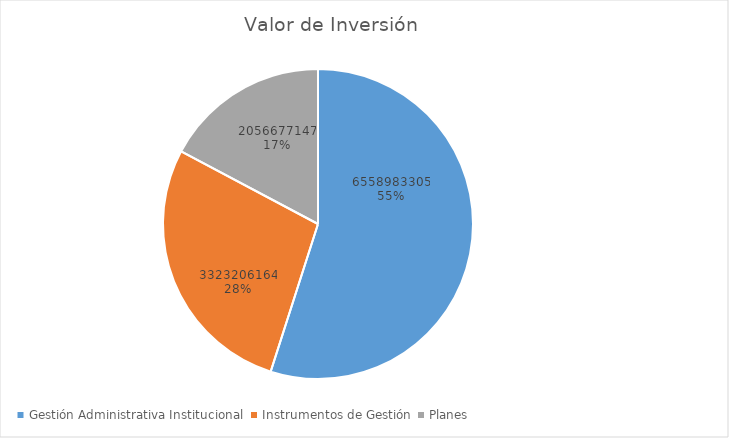
| Category | Valor de Inversión | Porcentaje de Ejecución dentro de la Actividad |
|---|---|---|
| Gestión Administrativa Institucional | 6558983305 | 22 |
| Instrumentos de Gestión | 3323206164 | 23 |
| Planes | 2056677147 | 17 |